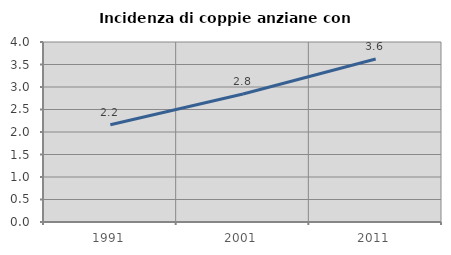
| Category | Incidenza di coppie anziane con figli |
|---|---|
| 1991.0 | 2.162 |
| 2001.0 | 2.845 |
| 2011.0 | 3.621 |